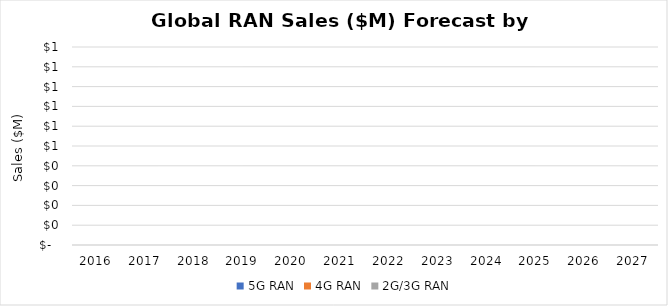
| Category | 5G RAN | 4G RAN | 2G/3G RAN |
|---|---|---|---|
| 2016.0 | 0 | 0 | 0 |
| 2017.0 | 0 | 0 | 0 |
| 2018.0 | 0 | 0 | 0 |
| 2019.0 | 0 | 0 | 0 |
| 2020.0 | 0 | 0 | 0 |
| 2021.0 | 0 | 0 | 0 |
| 2022.0 | 0 | 0 | 0 |
| 2023.0 | 0 | 0 | 0 |
| 2024.0 | 0 | 0 | 0 |
| 2025.0 | 0 | 0 | 0 |
| 2026.0 | 0 | 0 | 0 |
| 2027.0 | 0 | 0 | 0 |